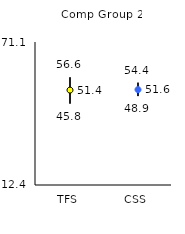
| Category | 25th | 75th | Mean |
|---|---|---|---|
| TFS | 45.8 | 56.6 | 51.36 |
| CSS | 48.9 | 54.4 | 51.56 |